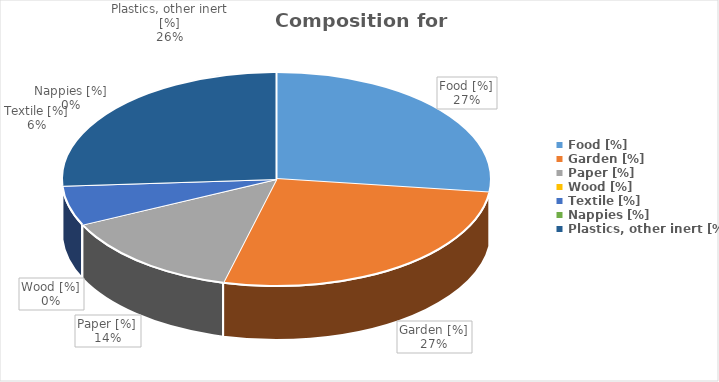
| Category | Series 0 |
|---|---|
| Food [%] | 27 |
| Garden [%] | 27 |
| Paper [%] | 14 |
| Wood [%] | 0 |
| Textile [%] | 6 |
| Nappies [%] | 0 |
| Plastics, other inert [%] | 26 |